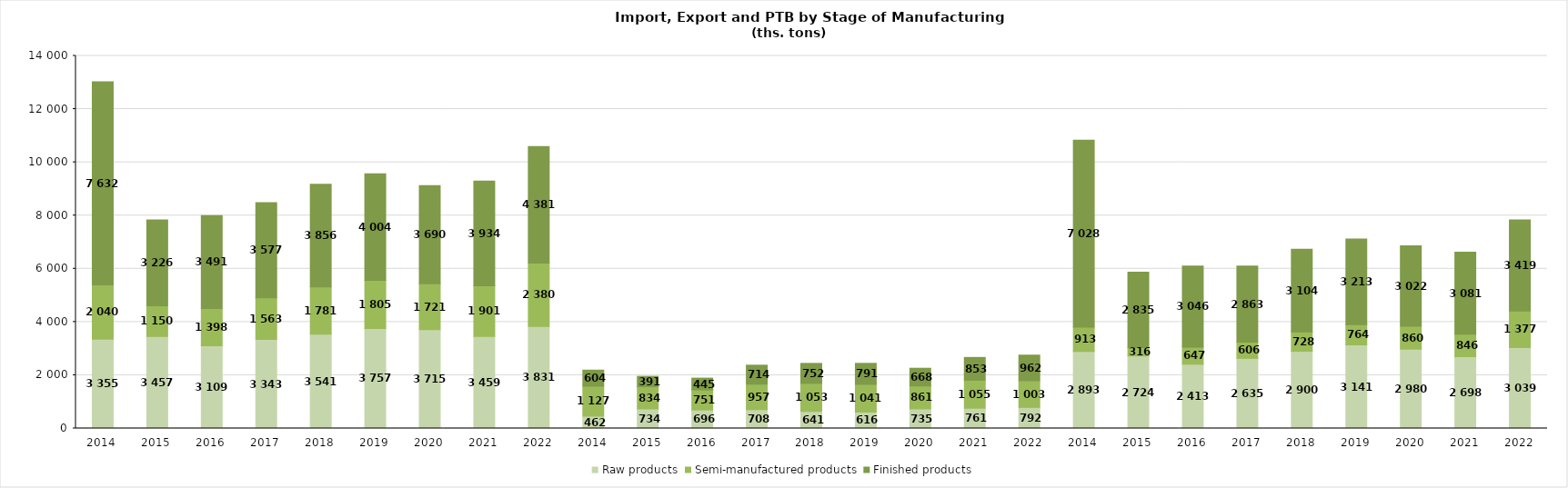
| Category | Raw products | Semi-manufactured products | Finished products |
|---|---|---|---|
| 2014.0 | 3355 | 2040 | 7632 |
| 2015.0 | 3457 | 1150 | 3226 |
| 2016.0 | 3109 | 1398 | 3491 |
| 2017.0 | 3343 | 1563 | 3577 |
| 2018.0 | 3541 | 1781 | 3856 |
| 2019.0 | 3757 | 1805 | 4004 |
| 2020.0 | 3715 | 1721 | 3690 |
| 2021.0 | 3459 | 1901 | 3934 |
| 2022.0 | 3831 | 2380 | 4381 |
| 2014.0 | 462 | 1127 | 604 |
| 2015.0 | 734 | 834 | 391 |
| 2016.0 | 696 | 751 | 445 |
| 2017.0 | 708 | 957 | 714 |
| 2018.0 | 641 | 1053 | 752 |
| 2019.0 | 616 | 1041 | 791 |
| 2020.0 | 735 | 861 | 668 |
| 2021.0 | 761 | 1055 | 853 |
| 2022.0 | 792 | 1003 | 962 |
| 2014.0 | 2893 | 913 | 7028 |
| 2015.0 | 2724 | 316 | 2835 |
| 2016.0 | 2413 | 647 | 3046 |
| 2017.0 | 2635 | 606 | 2863 |
| 2018.0 | 2900 | 728 | 3104 |
| 2019.0 | 3141 | 764 | 3213 |
| 2020.0 | 2980 | 860 | 3022 |
| 2021.0 | 2698 | 846 | 3081 |
| 2022.0 | 3039 | 1377 | 3419 |